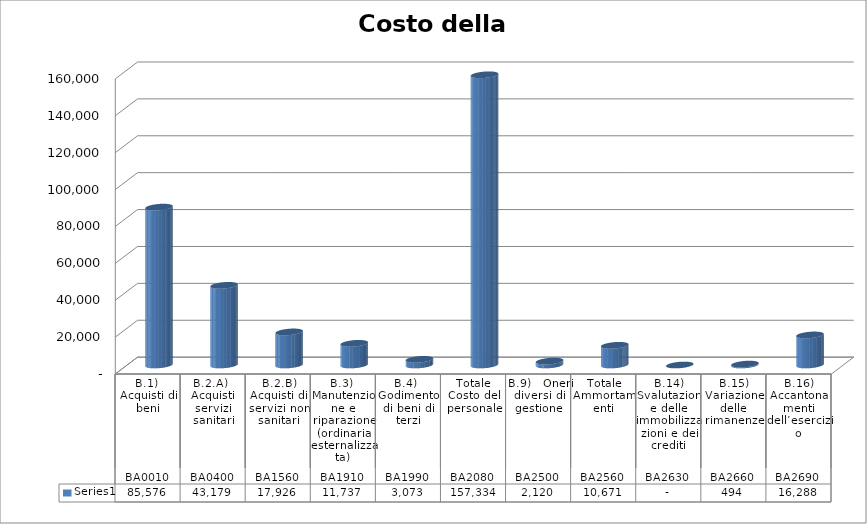
| Category | Series 0 |
|---|---|
| 0 | 85576.066 |
| 1 | 43178.909 |
| 2 | 17926.428 |
| 3 | 11737.069 |
| 4 | 3073.177 |
| 5 | 157333.562 |
| 6 | 2120.264 |
| 7 | 10671.151 |
| 8 | 0 |
| 9 | 493.804 |
| 10 | 16288.332 |